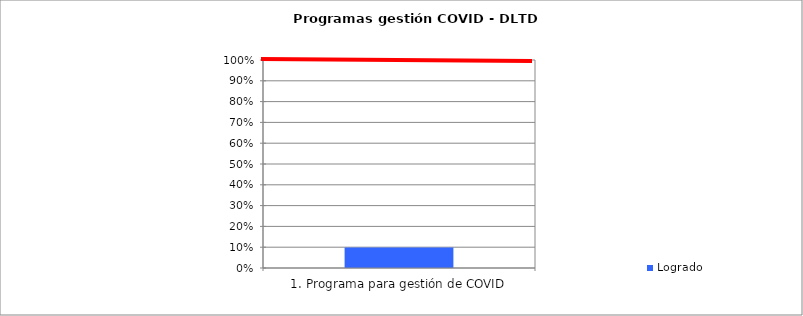
| Category | Logrado  |
|---|---|
| 1. Programa para gestión de COVID | 0.099 |